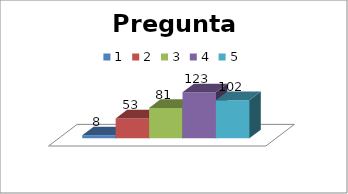
| Category | 1 | 2 | 3 | 4 | 5 |
|---|---|---|---|---|---|
| 0 | 8 | 53 | 81 | 123 | 102 |